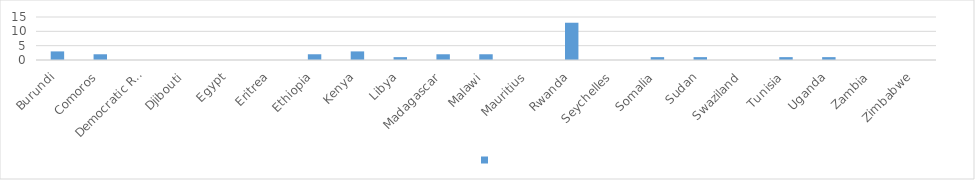
| Category | Series 0 |
|---|---|
| Burundi | 3 |
| Comoros | 2 |
| Democratic Republic of the Congo | 0 |
| Djibouti | 0 |
| Egypt | 0 |
| Eritrea | 0 |
| Ethiopia | 2 |
| Kenya | 3 |
| Libya | 1 |
| Madagascar | 2 |
| Malawi | 2 |
| Mauritius | 0 |
| Rwanda | 13 |
| Seychelles | 0 |
| Somalia | 1 |
| Sudan | 1 |
| Swaziland | 0 |
| Tunisia | 1 |
| Uganda | 1 |
| Zambia | 0 |
| Zimbabwe | 0 |